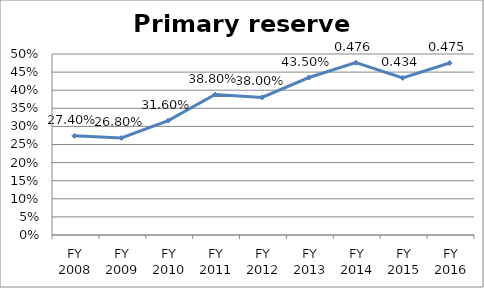
| Category | Primary reserve ratio |
|---|---|
| FY 2016 | 0.475 |
| FY 2015 | 0.434 |
| FY 2014 | 0.476 |
| FY 2013 | 0.435 |
| FY 2012 | 0.38 |
| FY 2011 | 0.388 |
| FY 2010 | 0.316 |
| FY 2009 | 0.268 |
| FY 2008 | 0.274 |